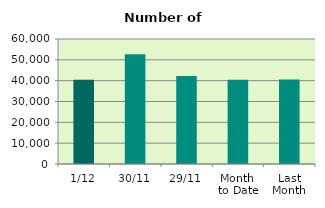
| Category | Series 0 |
|---|---|
| 1/12 | 40414 |
| 30/11 | 52736 |
| 29/11 | 42232 |
| Month 
to Date | 40414 |
| Last
Month | 40546.091 |